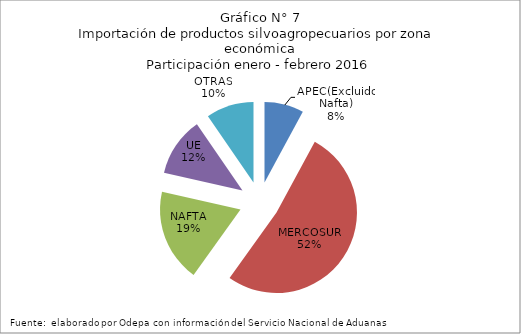
| Category | Series 0 |
|---|---|
| APEC(Excluido Nafta) | 57414.117 |
| MERCOSUR | 378467.746 |
| NAFTA | 135737.299 |
| UE | 86271.985 |
| OTRAS | 69736.853 |